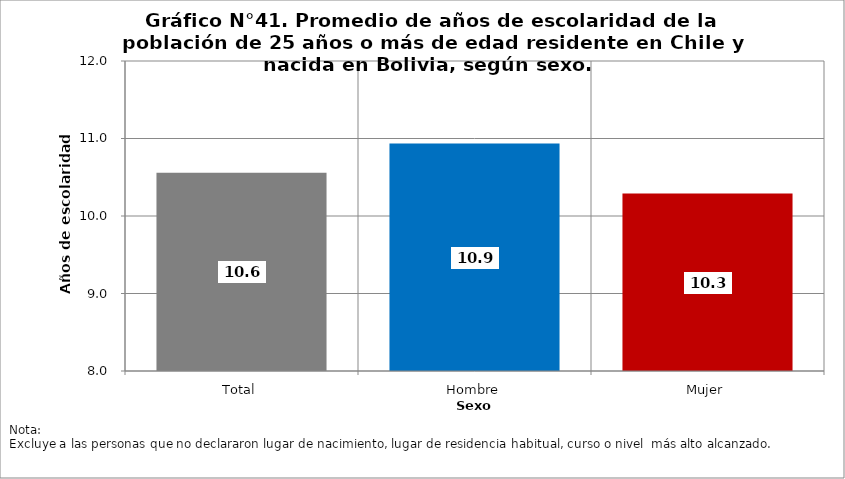
| Category | Series 0 |
|---|---|
| Total | 10.557 |
| Hombre | 10.935 |
| Mujer | 10.291 |